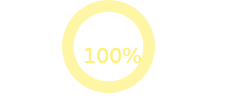
| Category | Ergebnis |
|---|---|
| Zielerreichung | 1 |
| Summe von Delta Ziel | 0 |